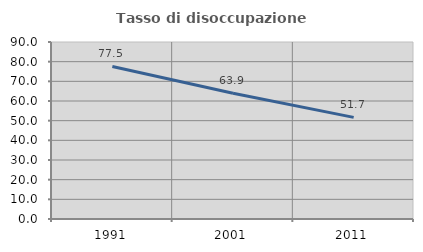
| Category | Tasso di disoccupazione giovanile  |
|---|---|
| 1991.0 | 77.549 |
| 2001.0 | 63.941 |
| 2011.0 | 51.664 |